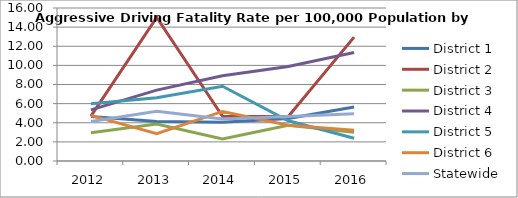
| Category | District 1 | District 2 | District 3 | District 4 | District 5 | District 6 | Statewide |
|---|---|---|---|---|---|---|---|
| 2012.0 | 4.641 | 4.695 | 2.956 | 5.343 | 5.997 | 4.773 | 4.136 |
| 2013.0 | 4.137 | 15.011 | 3.876 | 7.413 | 6.621 | 2.85 | 5.21 |
| 2014.0 | 4.065 | 4.671 | 2.306 | 8.924 | 7.82 | 5.183 | 4.405 |
| 2015.0 | 4.444 | 4.656 | 3.735 | 9.876 | 4.206 | 3.736 | 4.653 |
| 2016.0 | 5.65 | 12.954 | 3.006 | 11.343 | 2.384 | 3.208 | 4.931 |